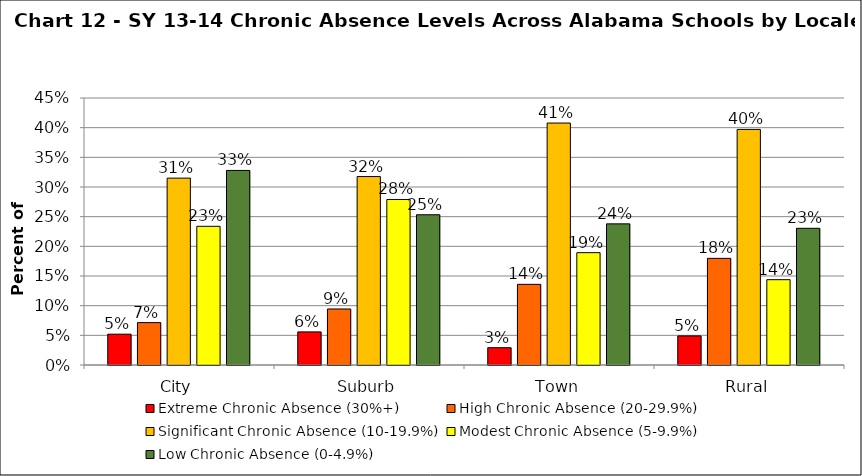
| Category | Extreme Chronic Absence (30%+) | High Chronic Absence (20-29.9%) | Significant Chronic Absence (10-19.9%) | Modest Chronic Absence (5-9.9%) | Low Chronic Absence (0-4.9%) |
|---|---|---|---|---|---|
| 0 | 0.052 | 0.071 | 0.315 | 0.234 | 0.328 |
| 1 | 0.056 | 0.094 | 0.318 | 0.279 | 0.253 |
| 2 | 0.029 | 0.136 | 0.408 | 0.189 | 0.238 |
| 3 | 0.049 | 0.18 | 0.397 | 0.144 | 0.23 |